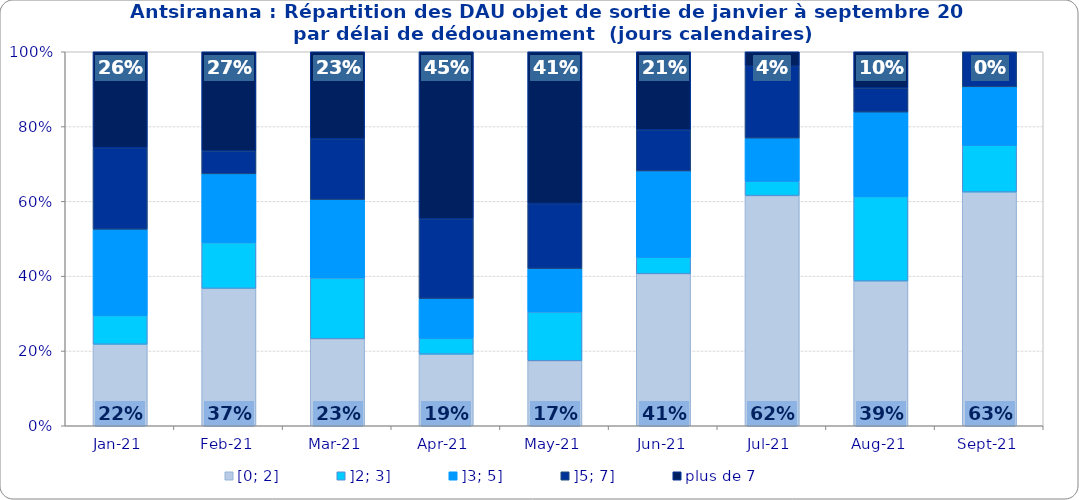
| Category | [0; 2] | ]2; 3] | ]3; 5] | ]5; 7] | plus de 7 |
|---|---|---|---|---|---|
| 2021-01-01 | 0.218 | 0.077 | 0.231 | 0.218 | 0.256 |
| 2021-02-01 | 0.367 | 0.122 | 0.184 | 0.061 | 0.265 |
| 2021-03-01 | 0.233 | 0.163 | 0.209 | 0.163 | 0.233 |
| 2021-04-01 | 0.191 | 0.043 | 0.106 | 0.213 | 0.447 |
| 2021-05-01 | 0.174 | 0.13 | 0.116 | 0.174 | 0.406 |
| 2021-06-01 | 0.407 | 0.044 | 0.231 | 0.11 | 0.209 |
| 2021-07-01 | 0.615 | 0.038 | 0.115 | 0.192 | 0.038 |
| 2021-08-01 | 0.387 | 0.226 | 0.226 | 0.065 | 0.097 |
| 2021-09-01 | 0.625 | 0.125 | 0.156 | 0.094 | 0 |